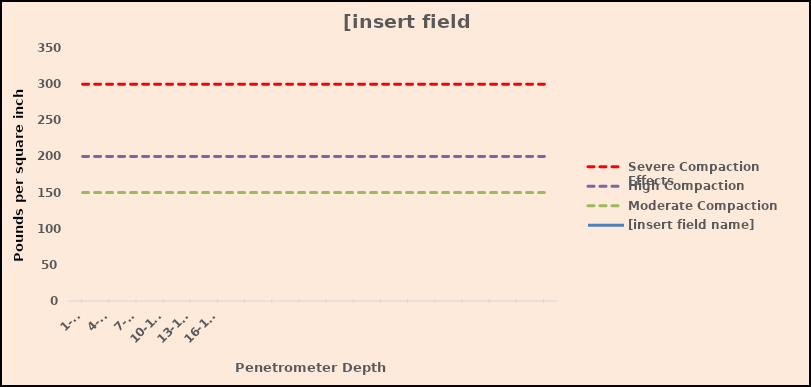
| Category | Severe Compaction Effects | High Compaction | Moderate Compaction | [insert field name] |
|---|---|---|---|---|
| 1-3" | 300 | 200 | 150 |  |
| 4-6" | 300 | 200 | 150 |  |
| 7-9' | 300 | 200 | 150 |  |
| 10-12" | 300 | 200 | 150 |  |
| 13-15" | 300 | 200 | 150 |  |
| 16-18" | 300 | 200 | 150 |  |